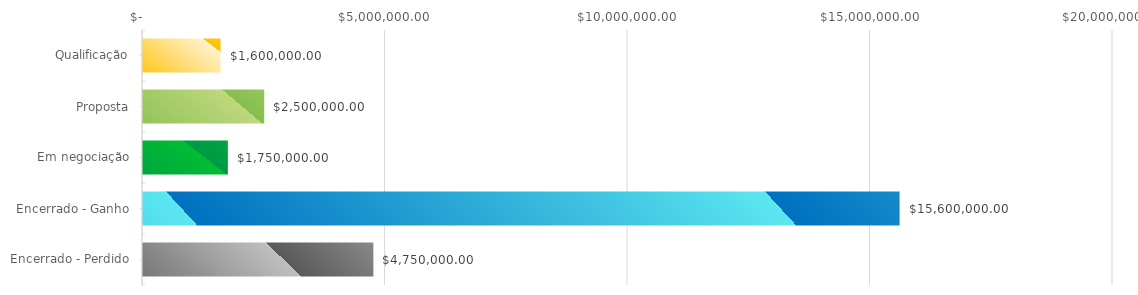
| Category | Series 0 |
|---|---|
| Qualificação | 1600000 |
| Proposta | 2500000 |
| Em negociação | 1750000 |
| Encerrado - Ganho | 15600000 |
| Encerrado - Perdido | 4750000 |